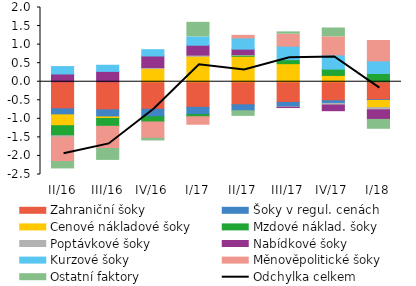
| Category | Zahraniční šoky | Šoky v regul. cenách | Cenové nákladové šoky | Mzdové náklad. šoky | Poptávkové šoky | Nabídkové šoky | Kurzové šoky | Měnověpolitické šoky | Ostatní faktory |
|---|---|---|---|---|---|---|---|---|---|
| II/16 | -0.731 | -0.162 | -0.292 | -0.271 | -0.04 | 0.209 | 0.2 | -0.655 | -0.199 |
| III/16 | -0.757 | -0.191 | -0.042 | -0.212 | -0.002 | 0.278 | 0.166 | -0.594 | -0.321 |
| IV/16 | -0.743 | -0.201 | 0.355 | -0.14 | 0.027 | 0.311 | 0.17 | -0.44 | -0.072 |
| I/17 | -0.691 | -0.195 | 0.683 | -0.057 | 0.035 | 0.265 | 0.224 | -0.203 | 0.393 |
| II/17 | -0.621 | -0.162 | 0.686 | 0.029 | 0.019 | 0.144 | 0.301 | 0.072 | -0.15 |
| III/17 | -0.558 | -0.118 | 0.487 | 0.108 | -0.013 | -0.007 | 0.364 | 0.322 | 0.064 |
| IV/17 | -0.512 | -0.072 | 0.17 | 0.17 | -0.045 | -0.151 | 0.38 | 0.488 | 0.239 |
| I/18 | -0.486 | -0.02 | -0.191 | 0.221 | -0.06 | -0.258 | 0.342 | 0.548 | -0.266 |